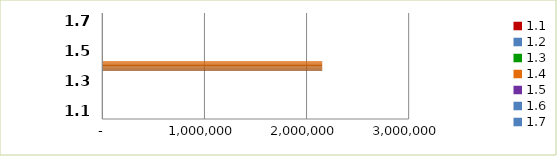
| Category | Series 0 |
|---|---|
| 1.1 | 0 |
| 1.2 | 0 |
| 1.3 | 0 |
| 1.4 | 2153292.01 |
| 1.5 | 0 |
| 1.6 | 0 |
| 1.7 | 0 |